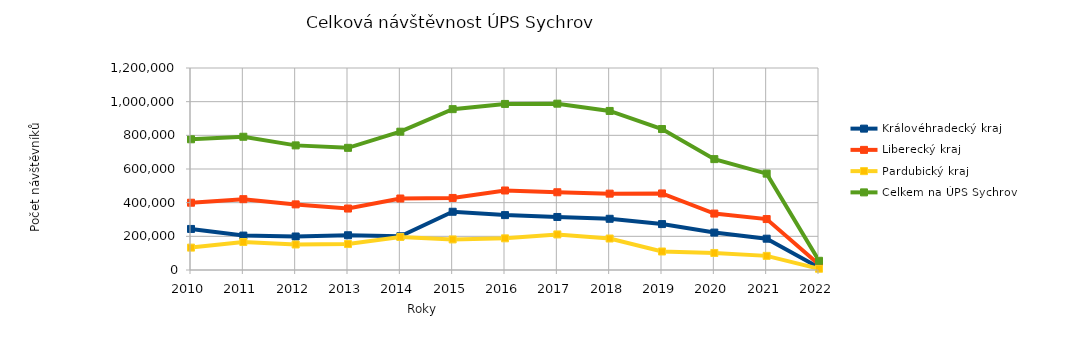
| Category | Královéhradecký kraj | Liberecký kraj | Pardubický kraj | Celkem na ÚPS Sychrov |
|---|---|---|---|---|
| 2010.0 | 243910 | 399672 | 133004 | 776586 |
| 2011.0 | 204481 | 420780 | 166238 | 791499 |
| 2012.0 | 199025 | 389781 | 151509 | 740315 |
| 2013.0 | 206419 | 365108 | 154165 | 725692 |
| 2014.0 | 200438 | 424718 | 196473 | 821629 |
| 2015.0 | 345970 | 428023 | 181567 | 955560 |
| 2016.0 | 326137 | 472318 | 188108 | 986563 |
| 2017.0 | 314983 | 461803 | 211268 | 988054 |
| 2018.0 | 304267 | 453568 | 187017 | 944852 |
| 2019.0 | 272720 | 454785 | 109949 | 837454 |
| 2020.0 | 222238 | 335261 | 101211 | 658710 |
| 2021.0 | 185934 | 302574 | 83925 | 572433 |
| 2022.0 | 14351 | 32995 | 7399 | 54745 |